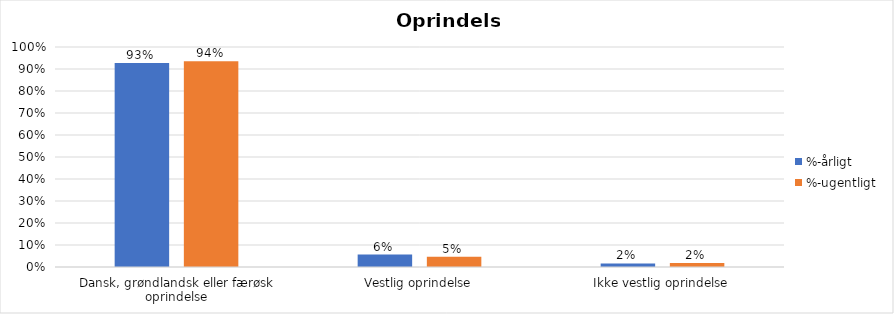
| Category | %-årligt | %-ugentligt |
|---|---|---|
| Dansk, grøndlandsk eller færøsk oprindelse | 0.927 | 0.935 |
| Vestlig oprindelse | 0.057 | 0.047 |
| Ikke vestlig oprindelse | 0.016 | 0.018 |